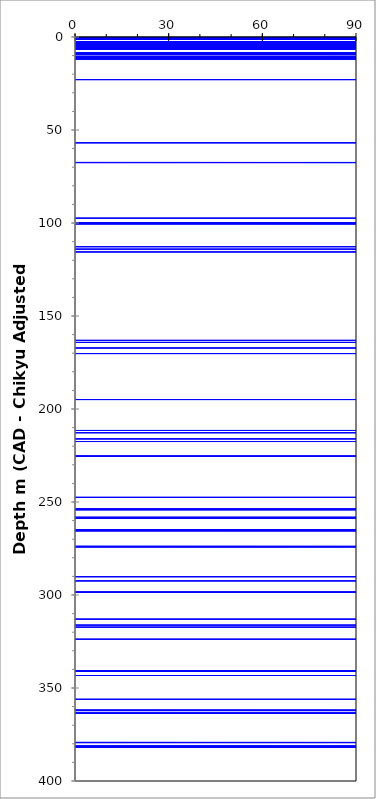
| Category | Series 0 |
|---|---|
| -10.0 | 0.068 |
| 360.0 | 0.068 |
| -10.0 | 0.068 |
| -10.0 | 0.22 |
| 360.0 | 0.22 |
| -10.0 | 0.22 |
| -10.0 | 0.254 |
| 360.0 | 0.254 |
| -10.0 | 0.254 |
| -10.0 | 0.593 |
| 360.0 | 0.593 |
| -10.0 | 0.593 |
| -10.0 | 0.652 |
| 360.0 | 0.652 |
| -10.0 | 0.652 |
| -10.0 | 1.258 |
| 360.0 | 1.258 |
| -10.0 | 1.258 |
| -10.0 | 1.3 |
| 360.0 | 1.3 |
| -10.0 | 1.3 |
| -10.0 | 1.344 |
| 360.0 | 1.344 |
| -10.0 | 1.344 |
| -10.0 | 2.5 |
| 360.0 | 2.5 |
| -10.0 | 2.5 |
| -10.0 | 2.7 |
| 360.0 | 2.7 |
| -10.0 | 2.7 |
| -10.0 | 2.727 |
| 360.0 | 2.727 |
| -10.0 | 2.727 |
| -10.0 | 2.879 |
| 360.0 | 2.879 |
| -10.0 | 2.879 |
| -10.0 | 3.014 |
| 360.0 | 3.014 |
| -10.0 | 3.014 |
| -10.0 | 3.095 |
| 360.0 | 3.095 |
| -10.0 | 3.095 |
| -10.0 | 3.149 |
| 360.0 | 3.149 |
| -10.0 | 3.149 |
| -10.0 | 3.382 |
| 360.0 | 3.382 |
| -10.0 | 3.382 |
| -10.0 | 3.4 |
| 360.0 | 3.4 |
| -10.0 | 3.4 |
| -10.0 | 3.8 |
| 360.0 | 3.8 |
| -10.0 | 3.8 |
| -10.0 | 3.982 |
| 360.0 | 3.982 |
| -10.0 | 3.982 |
| -10.0 | 4.782 |
| 360.0 | 4.782 |
| -10.0 | 4.782 |
| -10.0 | 4.9 |
| 360.0 | 4.9 |
| -10.0 | 4.9 |
| -10.0 | 5.05 |
| 360.0 | 5.05 |
| -10.0 | 5.05 |
| -10.0 | 5.11 |
| 360.0 | 5.11 |
| -10.0 | 5.11 |
| -10.0 | 5.19 |
| 360.0 | 5.19 |
| -10.0 | 5.19 |
| -10.0 | 5.45 |
| 360.0 | 5.45 |
| -10.0 | 5.45 |
| -10.0 | 5.65 |
| 360.0 | 5.65 |
| -10.0 | 5.65 |
| -10.0 | 5.75 |
| 360.0 | 5.75 |
| -10.0 | 5.75 |
| -10.0 | 5.968 |
| 360.0 | 5.968 |
| -10.0 | 5.968 |
| -10.0 | 6.395 |
| 360.0 | 6.395 |
| -10.0 | 6.395 |
| -10.0 | 6.55 |
| 360.0 | 6.55 |
| -10.0 | 6.55 |
| -10.0 | 6.645 |
| 360.0 | 6.645 |
| -10.0 | 6.645 |
| -10.0 | 8.53 |
| 360.0 | 8.53 |
| -10.0 | 8.53 |
| -10.0 | 8.865 |
| 360.0 | 8.865 |
| -10.0 | 8.865 |
| -10.0 | 9.46 |
| 360.0 | 9.46 |
| -10.0 | 9.46 |
| -10.0 | 9.498 |
| 360.0 | 9.498 |
| -10.0 | 9.498 |
| -10.0 | 10.613 |
| 360.0 | 10.613 |
| -10.0 | 10.613 |
| -10.0 | 11.119 |
| 360.0 | 11.119 |
| -10.0 | 11.119 |
| -10.0 | 11.481 |
| 360.0 | 11.481 |
| -10.0 | 11.481 |
| -10.0 | 11.533 |
| 360.0 | 11.533 |
| -10.0 | 11.533 |
| -10.0 | 11.587 |
| 360.0 | 11.587 |
| -10.0 | 11.587 |
| -10.0 | 11.759 |
| 360.0 | 11.759 |
| -10.0 | 11.759 |
| -10.0 | 11.837 |
| 360.0 | 11.837 |
| -10.0 | 11.837 |
| -10.0 | 11.85 |
| 360.0 | 11.85 |
| -10.0 | 11.85 |
| -10.0 | 22.915 |
| 360.0 | 22.915 |
| -10.0 | 22.915 |
| -10.0 | 56.885 |
| 360.0 | 56.885 |
| -10.0 | 56.885 |
| -10.0 | 67.46 |
| 360.0 | 67.46 |
| -10.0 | 67.46 |
| -10.0 | 67.55 |
| 360.0 | 67.55 |
| -10.0 | 67.55 |
| -10.0 | 97.401 |
| 360.0 | 97.401 |
| -10.0 | 97.401 |
| -10.0 | 99.782 |
| 360.0 | 99.782 |
| -10.0 | 99.782 |
| -10.0 | 100.3 |
| 360.0 | 100.3 |
| -10.0 | 100.3 |
| -10.0 | 100.329 |
| 360.0 | 100.329 |
| -10.0 | 100.329 |
| -10.0 | 100.503 |
| 360.0 | 100.503 |
| -10.0 | 100.503 |
| -10.0 | 112.752 |
| 360.0 | 112.752 |
| -10.0 | 112.752 |
| -10.0 | 114.059 |
| 360.0 | 114.059 |
| -10.0 | 114.059 |
| -10.0 | 115.55 |
| 360.0 | 115.55 |
| -10.0 | 115.55 |
| -10.0 | 163.102 |
| 360.0 | 163.102 |
| -10.0 | 163.102 |
| -10.0 | 164.2 |
| 360.0 | 164.2 |
| -10.0 | 164.2 |
| -10.0 | 167.2 |
| 360.0 | 167.2 |
| -10.0 | 167.2 |
| -10.0 | 170.2 |
| 360.0 | 170.2 |
| -10.0 | 170.2 |
| -10.0 | 194.922 |
| 360.0 | 194.922 |
| -10.0 | 194.922 |
| -10.0 | 211.546 |
| 360.0 | 211.546 |
| -10.0 | 211.546 |
| -10.0 | 212.76 |
| 360.0 | 212.76 |
| -10.0 | 212.76 |
| -10.0 | 216.07 |
| 360.0 | 216.07 |
| -10.0 | 216.07 |
| -10.0 | 217.485 |
| 360.0 | 217.485 |
| -10.0 | 217.485 |
| -10.0 | 225.332 |
| 360.0 | 225.332 |
| -10.0 | 225.332 |
| -10.0 | 225.474 |
| 360.0 | 225.474 |
| -10.0 | 225.474 |
| -10.0 | 247.505 |
| 360.0 | 247.505 |
| -10.0 | 247.505 |
| -10.0 | 253.765 |
| 360.0 | 253.765 |
| -10.0 | 253.765 |
| -10.0 | 254.264 |
| 360.0 | 254.264 |
| -10.0 | 254.264 |
| -10.0 | 258.2 |
| 360.0 | 258.2 |
| -10.0 | 258.2 |
| -10.0 | 258.765 |
| 360.0 | 258.765 |
| -10.0 | 258.765 |
| -10.0 | 264.953 |
| 360.0 | 264.953 |
| -10.0 | 264.953 |
| -10.0 | 264.988 |
| 360.0 | 264.988 |
| -10.0 | 264.988 |
| -10.0 | 265.339 |
| 360.0 | 265.339 |
| -10.0 | 265.339 |
| -10.0 | 265.4 |
| 360.0 | 265.4 |
| -10.0 | 265.4 |
| -10.0 | 265.496 |
| 360.0 | 265.496 |
| -10.0 | 265.496 |
| -10.0 | 273.86 |
| 360.0 | 273.86 |
| -10.0 | 273.86 |
| -10.0 | 274.019 |
| 360.0 | 274.019 |
| -10.0 | 274.019 |
| -10.0 | 274.16 |
| 360.0 | 274.16 |
| -10.0 | 274.16 |
| -10.0 | 290.166 |
| 360.0 | 290.166 |
| -10.0 | 290.166 |
| -10.0 | 292.413 |
| 360.0 | 292.413 |
| -10.0 | 292.413 |
| -10.0 | 298.482 |
| 360.0 | 298.482 |
| -10.0 | 298.482 |
| -10.0 | 298.496 |
| 360.0 | 298.496 |
| -10.0 | 298.496 |
| -10.0 | 312.98 |
| 360.0 | 312.98 |
| -10.0 | 312.98 |
| -10.0 | 316.194 |
| 360.0 | 316.194 |
| -10.0 | 316.194 |
| -10.0 | 317.28 |
| 360.0 | 317.28 |
| -10.0 | 317.28 |
| -10.0 | 323.77 |
| 360.0 | 323.77 |
| -10.0 | 323.77 |
| -10.0 | 340.67 |
| 360.0 | 340.67 |
| -10.0 | 340.67 |
| -10.0 | 340.97 |
| 360.0 | 340.97 |
| -10.0 | 340.97 |
| -10.0 | 341.1 |
| 360.0 | 341.1 |
| -10.0 | 341.1 |
| -10.0 | 343.285 |
| 360.0 | 343.285 |
| -10.0 | 343.285 |
| -10.0 | 356.066 |
| 360.0 | 356.066 |
| -10.0 | 356.066 |
| -10.0 | 361.954 |
| 360.0 | 361.954 |
| -10.0 | 361.954 |
| -10.0 | 362.056 |
| 360.0 | 362.056 |
| -10.0 | 362.056 |
| -10.0 | 362.168 |
| 360.0 | 362.168 |
| -10.0 | 362.168 |
| -10.0 | 363.5 |
| 360.0 | 363.5 |
| -10.0 | 363.5 |
| -10.0 | 363.57 |
| 360.0 | 363.57 |
| -10.0 | 363.57 |
| -10.0 | 379.275 |
| 360.0 | 379.275 |
| -10.0 | 379.275 |
| -10.0 | 379.392 |
| 360.0 | 379.392 |
| -10.0 | 379.392 |
| -10.0 | 381.29 |
| 360.0 | 381.29 |
| -10.0 | 381.29 |
| -10.0 | 381.33 |
| 360.0 | 381.33 |
| -10.0 | 381.33 |
| -10.0 | 381.44 |
| 360.0 | 381.44 |
| -10.0 | 381.44 |
| -10.0 | 381.68 |
| 360.0 | 381.68 |
| -10.0 | 381.68 |
| -10.0 | 381.82 |
| 360.0 | 381.82 |
| -10.0 | 381.82 |